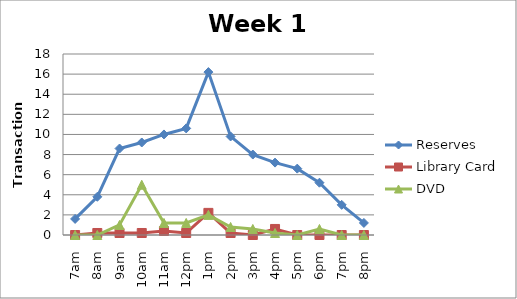
| Category | Reserves | Library Card | DVD |
|---|---|---|---|
| 7am | 1.6 | 0 | 0 |
| 8am | 3.8 | 0.2 | 0 |
| 9am | 8.6 | 0.2 | 1 |
| 10am | 9.2 | 0.2 | 5 |
| 11am | 10 | 0.4 | 1.2 |
| 12pm | 10.6 | 0.2 | 1.2 |
| 1pm | 16.2 | 2.2 | 2 |
| 2pm | 9.8 | 0.2 | 0.8 |
| 3pm | 8 | 0 | 0.6 |
| 4pm | 7.2 | 0.6 | 0.2 |
| 5pm | 6.6 | 0 | 0 |
| 6pm | 5.2 | 0 | 0.6 |
| 7pm | 3 | 0 | 0 |
| 8pm | 1.2 | 0 | 0 |